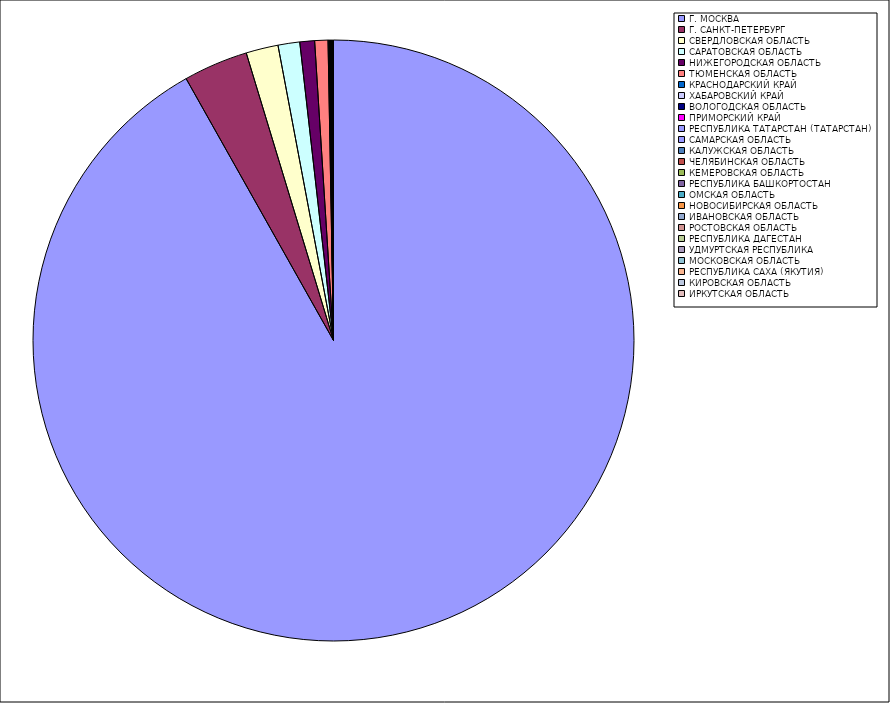
| Category | Оборот |
|---|---|
| Г. МОСКВА | 91.803 |
| Г. САНКТ-ПЕТЕРБУРГ | 3.468 |
| СВЕРДЛОВСКАЯ ОБЛАСТЬ | 1.73 |
| САРАТОВСКАЯ ОБЛАСТЬ | 1.166 |
| НИЖЕГОРОДСКАЯ ОБЛАСТЬ | 0.791 |
| ТЮМЕНСКАЯ ОБЛАСТЬ | 0.711 |
| КРАСНОДАРСКИЙ КРАЙ | 0.047 |
| ХАБАРОВСКИЙ КРАЙ | 0.026 |
| ВОЛОГОДСКАЯ ОБЛАСТЬ | 0.022 |
| ПРИМОРСКИЙ КРАЙ | 0.02 |
| РЕСПУБЛИКА ТАТАРСТАН (ТАТАРСТАН) | 0.019 |
| САМАРСКАЯ ОБЛАСТЬ | 0.016 |
| КАЛУЖСКАЯ ОБЛАСТЬ | 0.016 |
| ЧЕЛЯБИНСКАЯ ОБЛАСТЬ | 0.016 |
| КЕМЕРОВСКАЯ ОБЛАСТЬ | 0.015 |
| РЕСПУБЛИКА БАШКОРТОСТАН | 0.015 |
| ОМСКАЯ ОБЛАСТЬ | 0.012 |
| НОВОСИБИРСКАЯ ОБЛАСТЬ | 0.011 |
| ИВАНОВСКАЯ ОБЛАСТЬ | 0.009 |
| РОСТОВСКАЯ ОБЛАСТЬ | 0.008 |
| РЕСПУБЛИКА ДАГЕСТАН | 0.007 |
| УДМУРТСКАЯ РЕСПУБЛИКА | 0.007 |
| МОСКОВСКАЯ ОБЛАСТЬ | 0.006 |
| РЕСПУБЛИКА САХА (ЯКУТИЯ) | 0.006 |
| КИРОВСКАЯ ОБЛАСТЬ | 0.006 |
| ИРКУТСКАЯ ОБЛАСТЬ | 0.006 |